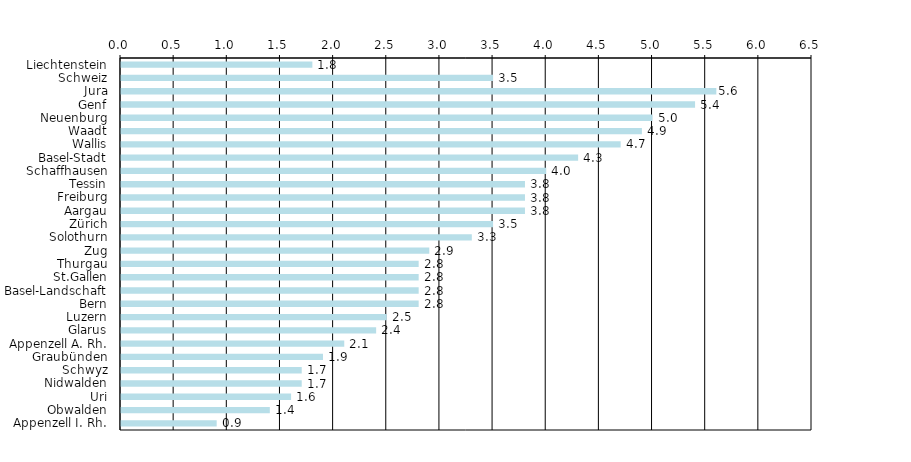
| Category | Series 0 |
|---|---|
| Liechtenstein | 1.8 |
| Schweiz | 3.5 |
| Jura | 5.6 |
| Genf | 5.4 |
| Neuenburg | 5 |
| Waadt | 4.9 |
| Wallis | 4.7 |
| Basel-Stadt | 4.3 |
| Schaffhausen | 4 |
| Tessin | 3.8 |
| Freiburg | 3.8 |
| Aargau | 3.8 |
| Zürich | 3.5 |
| Solothurn | 3.3 |
| Zug | 2.9 |
| Thurgau | 2.8 |
| St.Gallen | 2.8 |
| Basel-Landschaft | 2.8 |
| Bern | 2.8 |
| Luzern | 2.5 |
| Glarus | 2.4 |
| Appenzell A. Rh. | 2.1 |
| Graubünden | 1.9 |
| Schwyz | 1.7 |
| Nidwalden | 1.7 |
| Uri | 1.6 |
| Obwalden | 1.4 |
| Appenzell I. Rh. | 0.9 |